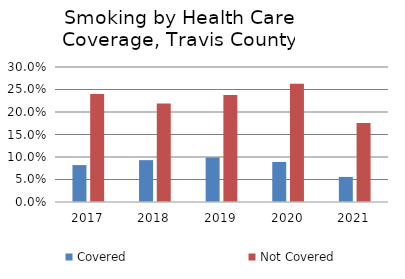
| Category | Covered | Not Covered |
|---|---|---|
| 2017.0 | 0.082 | 0.24 |
| 2018.0 | 0.093 | 0.219 |
| 2019.0 | 0.099 | 0.238 |
| 2020.0 | 0.089 | 0.263 |
| 2021.0 | 0.056 | 0.176 |